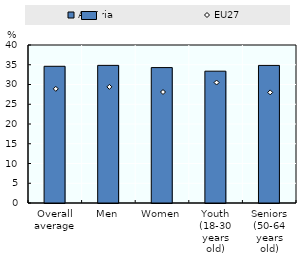
| Category | Austria |
|---|---|
| Overall average | 34.609 |
| Men | 34.843 |
| Women | 34.283 |
| Youth (18-30 years old) | 33.37 |
| Seniors (50-64 years old) | 34.832 |